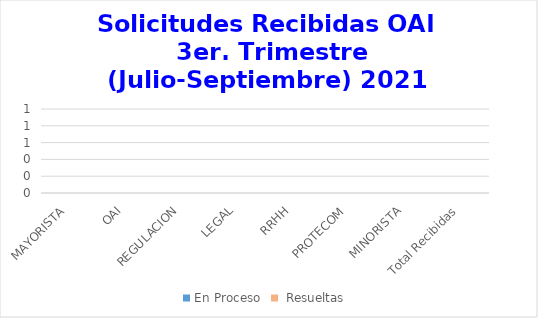
| Category | En Proceso |  Resueltas  |
|---|---|---|
| MAYORISTA | 0 | 0 |
| OAI | 0 | 0 |
| REGULACION | 0 | 0 |
| LEGAL | 0 | 0 |
| RRHH | 0 | 0 |
| PROTECOM | 0 | 0 |
| MINORISTA | 0 | 0 |
| Total Recibidas | 0 | 0 |